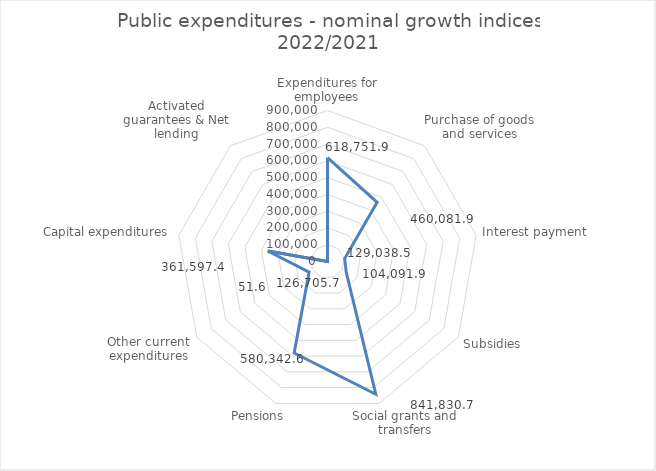
| Category | Series 0 |
|---|---|
| Expenditures for employees | 618751.914 |
| Purchase of goods and services | 460081.92 |
| Interest payment | 104091.923 |
| Subsidies | 129038.54 |
| Social grants and transfers | 841830.749 |
| Pensions | 580342.56 |
| Other current expenditures | 126705.717 |
| Capital expenditures | 361597.404 |
| Activated guarantees & Net lending | 51.63 |